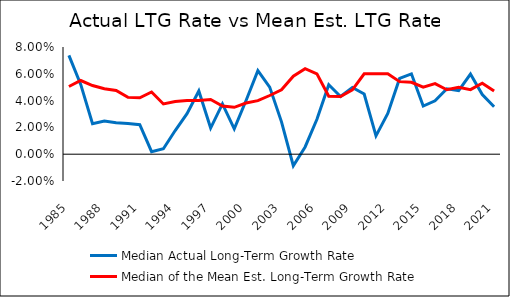
| Category | Median Actual Long-Term Growth Rate | Median of the Mean Est. Long-Term Growth Rate |
|---|---|---|
| 1985.0 | 0.074 | 0.05 |
| 1986.0 | 0.052 | 0.055 |
| 1987.0 | 0.023 | 0.051 |
| 1988.0 | 0.025 | 0.049 |
| 1989.0 | 0.023 | 0.048 |
| 1990.0 | 0.023 | 0.042 |
| 1991.0 | 0.022 | 0.042 |
| 1992.0 | 0.002 | 0.046 |
| 1993.0 | 0.004 | 0.038 |
| 1994.0 | 0.018 | 0.039 |
| 1995.0 | 0.03 | 0.04 |
| 1996.0 | 0.047 | 0.04 |
| 1997.0 | 0.02 | 0.041 |
| 1998.0 | 0.037 | 0.036 |
| 1999.0 | 0.019 | 0.035 |
| 2000.0 | 0.04 | 0.038 |
| 2001.0 | 0.062 | 0.04 |
| 2002.0 | 0.05 | 0.044 |
| 2003.0 | 0.024 | 0.048 |
| 2004.0 | -0.009 | 0.058 |
| 2005.0 | 0.005 | 0.064 |
| 2006.0 | 0.026 | 0.06 |
| 2007.0 | 0.052 | 0.043 |
| 2008.0 | 0.043 | 0.043 |
| 2009.0 | 0.05 | 0.048 |
| 2010.0 | 0.045 | 0.06 |
| 2011.0 | 0.014 | 0.06 |
| 2012.0 | 0.03 | 0.06 |
| 2013.0 | 0.057 | 0.054 |
| 2014.0 | 0.06 | 0.054 |
| 2015.0 | 0.036 | 0.05 |
| 2016.0 | 0.04 | 0.053 |
| 2017.0 | 0.049 | 0.048 |
| 2018.0 | 0.047 | 0.05 |
| 2019.0 | 0.06 | 0.048 |
| 2020.0 | 0.045 | 0.053 |
| 2021.0 | 0.035 | 0.047 |